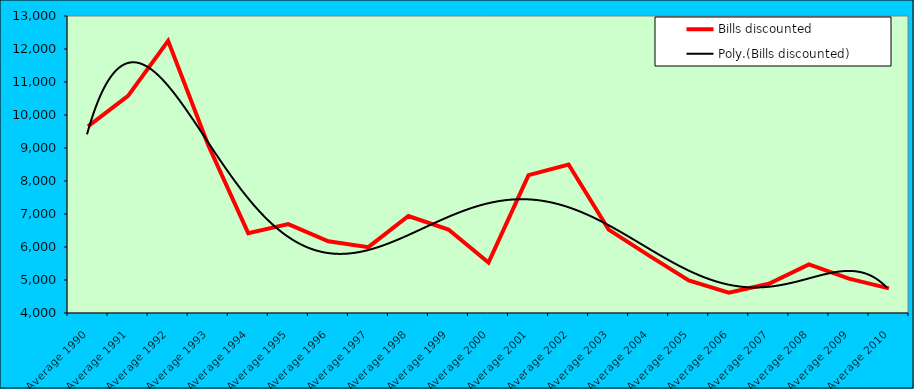
| Category | Bills discounted |
|---|---|
| Average 1990 | 9655.833 |
| Average 1991 | 10577.833 |
| Average 1992 | 12245.5 |
| Average 1993 | 9091.417 |
| Average 1994 | 6421.417 |
| Average 1995 | 6692.5 |
| Average 1996 | 6175.25 |
| Average 1997 | 5996.167 |
| Average 1998 | 6938.167 |
| Average 1999 | 6530.909 |
| Average 2000 | 5530.583 |
| Average 2001 | 8177 |
| Average 2002 | 8501.333 |
| Average 2003 | 6526.417 |
| Average 2004 | 5747 |
| Average 2005 | 4985.583 |
| Average 2006 | 4617.083 |
| Average 2007 | 4884.833 |
| Average 2008 | 5474.917 |
| Average 2009 | 5040.417 |
| Average 2010 | 4745.25 |